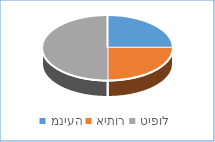
| Category | Series 0 |
|---|---|
| מניעה | 2 |
| איתור | 2 |
| טיפול | 4 |